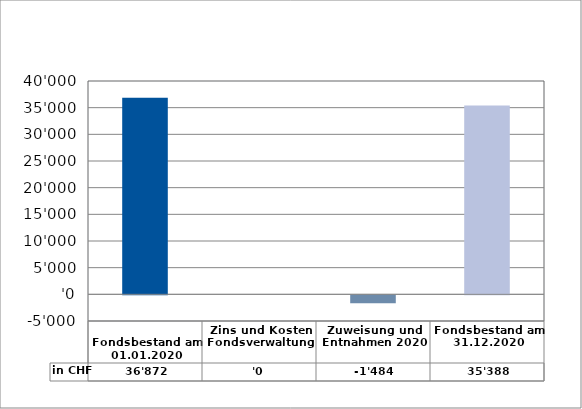
| Category | in CHF |
|---|---|
| 
Fondsbestand am 01.01.2020

 | 36872 |
| Zins und Kosten Fondsverwaltung | 0 |
| Zuweisung und Entnahmen 2020 | -1484.3 |
| Fondsbestand am 31.12.2020 | 35387.7 |